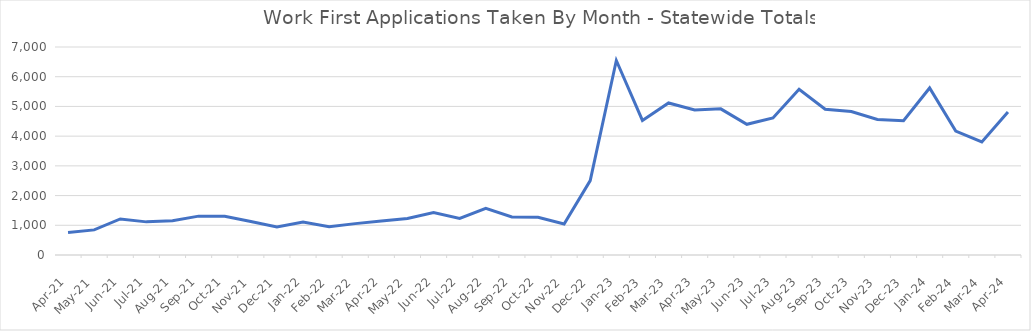
| Category | Series 0 |
|---|---|
| 2024-04-24 | 4813 |
| 2024-03-24 | 3803 |
| 2024-02-24 | 4172 |
| 2024-01-24 | 5621 |
| 2023-12-23 | 4519 |
| 2023-11-23 | 4563 |
| 2023-10-23 | 4827 |
| 2023-09-23 | 4905 |
| 2023-08-23 | 5577 |
| 2023-07-23 | 4613 |
| 2023-06-23 | 4398 |
| 2023-05-23 | 4918 |
| 2023-04-23 | 4882 |
| 2023-03-23 | 5117 |
| 2023-02-01 | 4530 |
| 2023-01-01 | 6546 |
| 2022-12-01 | 2505 |
| 2022-11-22 | 1044 |
| 2022-10-22 | 1268 |
| 2022-09-22 | 1279 |
| 2022-08-22 | 1568 |
| 2022-07-22 | 1228 |
| 2022-06-01 | 1433 |
| 2022-05-01 | 1230 |
| 2022-04-01 | 1142 |
| 2022-03-01 | 1056 |
| 2022-02-01 | 953 |
| 2022-01-01 | 1113 |
| 2021-12-02 | 940 |
| 2021-11-01 | 1127 |
| 2021-10-01 | 1301 |
| 2021-09-01 | 1308 |
| 2021-08-01 | 1156 |
| 2021-07-01 | 1115 |
| 2021-06-01 | 1214 |
| 2021-05-01 | 845 |
| 2021-04-01 | 759 |